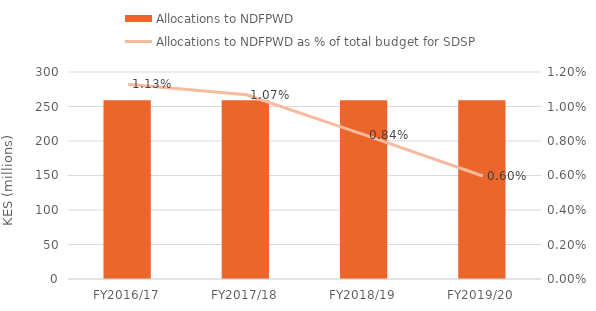
| Category | Allocations to NDFPWD |
|---|---|
| FY2016/17 | 259000000 |
| FY2017/18 | 259000000 |
| FY2018/19 | 259000000 |
| FY2019/20 | 259000000 |